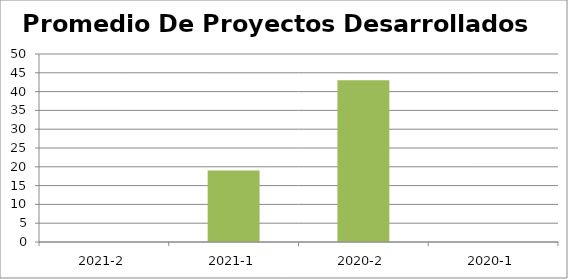
| Category | Promedio De Proyectos Desarrollados |
|---|---|
| 2021-2 | 0 |
| 2021-1 | 19 |
| 2020-2 | 43 |
| 2020-1 | 0 |